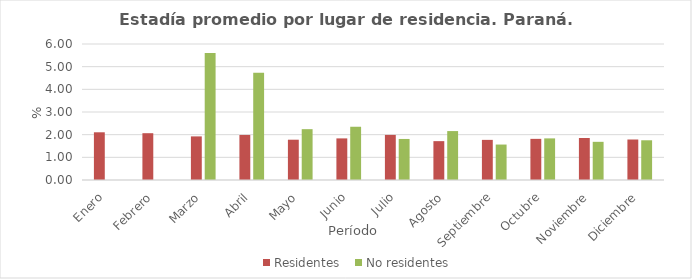
| Category | Residentes | No residentes |
|---|---|---|
| Enero | 2.105 | 0 |
| Febrero | 2.065 | 0 |
| Marzo | 1.924 | 5.605 |
| Abril | 1.988 | 4.73 |
| Mayo | 1.778 | 2.243 |
| Junio | 1.835 | 2.349 |
| Julio | 1.99 | 1.811 |
| Agosto | 1.714 | 2.159 |
| Septiembre | 1.77 | 1.564 |
| Octubre | 1.815 | 1.836 |
| Noviembre | 1.852 | 1.684 |
| Diciembre | 1.787 | 1.752 |